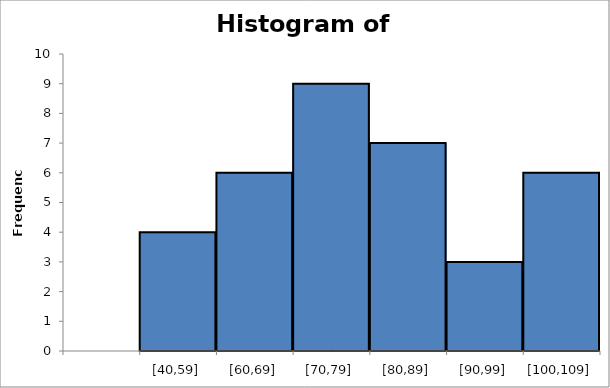
| Category | Series 0 |
|---|---|
|  | 0 |
| [40,59] | 4 |
| [60,69] | 6 |
| [70,79] | 9 |
| [80,89] | 7 |
| [90,99] | 3 |
| [100,109] | 6 |